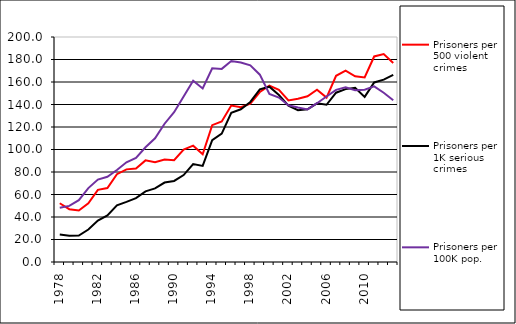
| Category | Prisoners per 500 violent crimes | Prisoners per 1K serious crimes | Prisoners per 100K pop. |
|---|---|---|---|
| 1978.0 | 52.206 | 24.397 | 48.233 |
| 1979.0 | 46.933 | 23.348 | 49.87 |
| 1980.0 | 45.726 | 23.483 | 54.99 |
| 1981.0 | 52.256 | 28.861 | 65.702 |
| 1982.0 | 64.152 | 36.774 | 73.309 |
| 1983.0 | 65.717 | 41.419 | 75.811 |
| 1984.0 | 78.025 | 50.341 | 81.718 |
| 1985.0 | 82.339 | 53.436 | 88.629 |
| 1986.0 | 83.077 | 56.841 | 92.524 |
| 1987.0 | 90.321 | 62.786 | 101.998 |
| 1988.0 | 88.726 | 65.411 | 109.947 |
| 1989.0 | 91.05 | 70.621 | 122.916 |
| 1990.0 | 90.451 | 72.041 | 133.202 |
| 1991.0 | 99.925 | 77.299 | 147.115 |
| 1992.0 | 103.42 | 87.037 | 161.137 |
| 1993.0 | 95.82 | 85.386 | 154.258 |
| 1994.0 | 121.652 | 108.376 | 172.173 |
| 1995.0 | 124.907 | 114.071 | 171.666 |
| 1996.0 | 139.052 | 132.654 | 178.595 |
| 1997.0 | 137.614 | 135.754 | 177.297 |
| 1998.0 | 140.658 | 142.258 | 174.784 |
| 1999.0 | 151.104 | 153.492 | 166.506 |
| 2000.0 | 156.781 | 155.828 | 149.297 |
| 2001.0 | 152.934 | 148.457 | 146.145 |
| 2002.0 | 143.672 | 138.972 | 139.322 |
| 2003.0 | 145.077 | 134.894 | 137.282 |
| 2004.0 | 147.309 | 135.78 | 135.594 |
| 2005.0 | 153.168 | 141.071 | 141.155 |
| 2006.0 | 146.123 | 139.771 | 147.145 |
| 2007.0 | 165.515 | 150.479 | 153.06 |
| 2008.0 | 170.068 | 153.686 | 155.358 |
| 2009.0 | 165.066 | 154.88 | 152.724 |
| 2010.0 | 164.092 | 146.765 | 153.139 |
| 2011.0 | 182.7 | 159.604 | 156.137 |
| 2012.0 | 184.845 | 162.106 | 150.467 |
| 2013.0 | 176.845 | 166.316 | 143.735 |